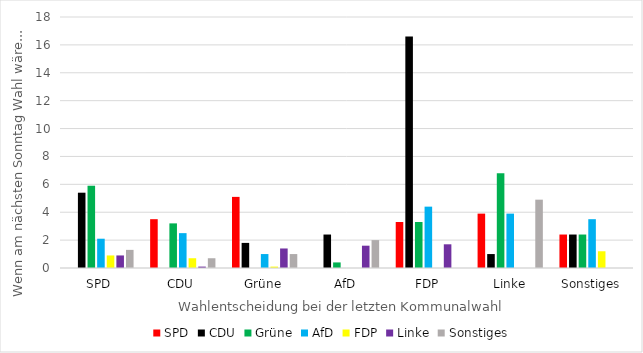
| Category | SPD | CDU | Grüne | AfD | FDP | Linke | Sonstiges |
|---|---|---|---|---|---|---|---|
| SPD | 0 | 5.4 | 5.9 | 2.1 | 0.9 | 0.9 | 1.3 |
| CDU | 3.5 | 0 | 3.2 | 2.5 | 0.7 | 0.1 | 0.7 |
| Grüne | 5.1 | 1.8 | 0 | 1 | 0.1 | 1.4 | 1 |
| AfD | 0 | 2.4 | 0.4 | 0 | 0 | 1.6 | 2 |
| FDP | 3.3 | 16.6 | 3.3 | 4.4 | 0 | 1.7 | 0 |
| Linke | 3.9 | 1 | 6.8 | 3.9 | 0 | 0 | 4.9 |
| Sonstiges | 2.4 | 2.4 | 2.4 | 3.5 | 1.2 | 0 | 0 |